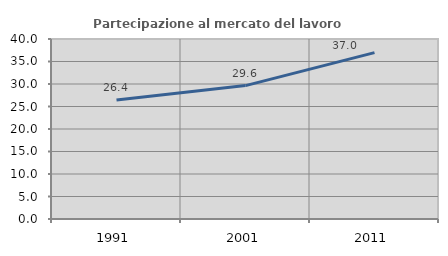
| Category | Partecipazione al mercato del lavoro  femminile |
|---|---|
| 1991.0 | 26.434 |
| 2001.0 | 29.646 |
| 2011.0 | 36.979 |